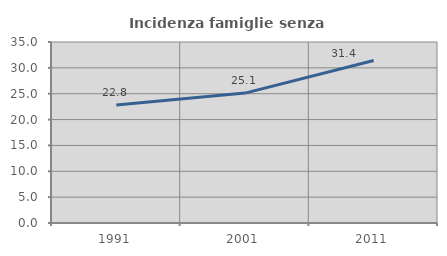
| Category | Incidenza famiglie senza nuclei |
|---|---|
| 1991.0 | 22.831 |
| 2001.0 | 25.116 |
| 2011.0 | 31.43 |